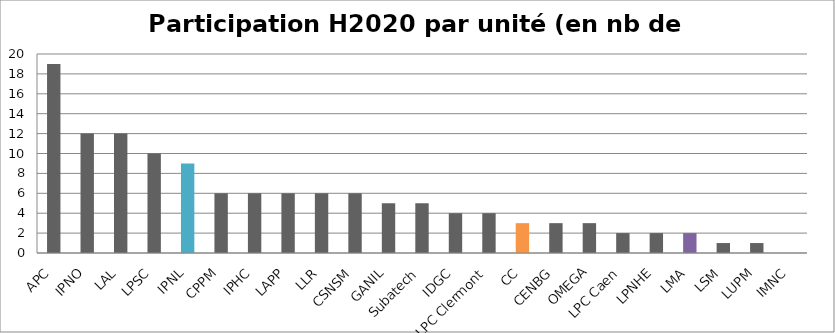
| Category | En nb de projets |
|---|---|
| APC | 19 |
| IPNO | 12 |
| LAL | 12 |
| LPSC | 10 |
| IPNL | 9 |
| CPPM | 6 |
| IPHC | 6 |
| LAPP | 6 |
| LLR | 6 |
| CSNSM | 6 |
| GANIL | 5 |
| Subatech | 5 |
| IDGC | 4 |
| LPC Clermont | 4 |
| CC | 3 |
| CENBG | 3 |
| OMEGA | 3 |
| LPC Caen | 2 |
| LPNHE | 2 |
| LMA | 2 |
| LSM | 1 |
| LUPM | 1 |
| IMNC | 0 |